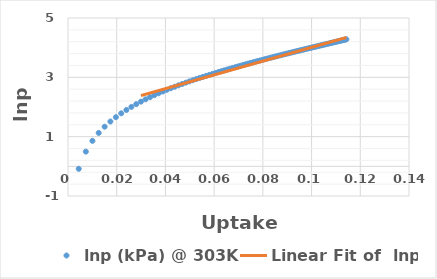
| Category | lnp (kPa) @ 303K |
|---|---|
| 0.0044 | -0.083 |
| 0.00732 | 0.496 |
| 0.01003 | 0.86 |
| 0.0126 | 1.126 |
| 0.01505 | 1.336 |
| 0.01741 | 1.51 |
| 0.01967 | 1.658 |
| 0.02186 | 1.786 |
| 0.02398 | 1.901 |
| 0.02603 | 2.003 |
| 0.02802 | 2.096 |
| 0.02996 | 2.181 |
| 0.03184 | 2.259 |
| 0.03368 | 2.332 |
| 0.03547 | 2.4 |
| 0.03721 | 2.463 |
| 0.03892 | 2.523 |
| 0.04058 | 2.579 |
| 0.04221 | 2.632 |
| 0.0438 | 2.683 |
| 0.04535 | 2.731 |
| 0.04687 | 2.776 |
| 0.04836 | 2.82 |
| 0.04982 | 2.862 |
| 0.05126 | 2.903 |
| 0.05266 | 2.942 |
| 0.05403 | 2.979 |
| 0.05538 | 3.015 |
| 0.05671 | 3.05 |
| 0.05801 | 3.083 |
| 0.05928 | 3.116 |
| 0.06054 | 3.147 |
| 0.06177 | 3.178 |
| 0.06298 | 3.208 |
| 0.06417 | 3.236 |
| 0.06534 | 3.264 |
| 0.06648 | 3.291 |
| 0.06761 | 3.318 |
| 0.06873 | 3.344 |
| 0.06982 | 3.369 |
| 0.07089 | 3.393 |
| 0.07195 | 3.417 |
| 0.073 | 3.441 |
| 0.07402 | 3.463 |
| 0.07503 | 3.486 |
| 0.07603 | 3.508 |
| 0.07701 | 3.529 |
| 0.07797 | 3.55 |
| 0.07893 | 3.571 |
| 0.07986 | 3.591 |
| 0.08079 | 3.61 |
| 0.0817 | 3.63 |
| 0.0826 | 3.649 |
| 0.08348 | 3.667 |
| 0.08436 | 3.685 |
| 0.08522 | 3.703 |
| 0.08607 | 3.721 |
| 0.08691 | 3.738 |
| 0.08773 | 3.755 |
| 0.08855 | 3.772 |
| 0.08935 | 3.788 |
| 0.09015 | 3.805 |
| 0.09093 | 3.82 |
| 0.09171 | 3.836 |
| 0.09247 | 3.852 |
| 0.09323 | 3.867 |
| 0.09397 | 3.882 |
| 0.09471 | 3.897 |
| 0.09544 | 3.911 |
| 0.09616 | 3.926 |
| 0.09687 | 3.94 |
| 0.09757 | 3.954 |
| 0.09826 | 3.967 |
| 0.09894 | 3.981 |
| 0.09962 | 3.994 |
| 0.10029 | 4.007 |
| 0.10095 | 4.02 |
| 0.1016 | 4.033 |
| 0.10225 | 4.046 |
| 0.10289 | 4.059 |
| 0.10352 | 4.071 |
| 0.10414 | 4.083 |
| 0.10476 | 4.095 |
| 0.10537 | 4.107 |
| 0.10598 | 4.119 |
| 0.10657 | 4.131 |
| 0.10716 | 4.142 |
| 0.10775 | 4.154 |
| 0.10833 | 4.165 |
| 0.1089 | 4.176 |
| 0.10946 | 4.187 |
| 0.11002 | 4.198 |
| 0.11058 | 4.209 |
| 0.11113 | 4.219 |
| 0.11167 | 4.23 |
| 0.11221 | 4.24 |
| 0.11274 | 4.251 |
| 0.11327 | 4.261 |
| 0.11379 | 4.271 |
| 0.1143 | 4.281 |